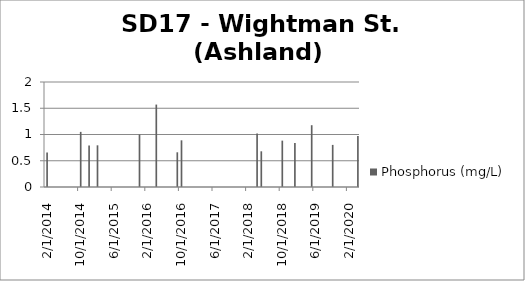
| Category | Phosphorus (mg/L) |
|---|---|
| 2/12/14 | 0.657 |
| 10/8/14 | 1.05 |
| 12/11/14 | 0.791 |
| 2/2/15 | 0.794 |
| 12/10/15 | 1 |
| 4/14/16 | 1.57 |
| 9/7/16 | 0.661 |
| 10/14/16 | 0.889 |
| 4/12/18 | 1.02 |
| 5/16/18 | 0.68 |
| 10/24/18 | 0.883 |
| 1/17/19 | 0.84 |
| 5/16/19 | 1.177 |
| 10/17/19 | 0.802 |
| 4/22/20 | 0.972 |